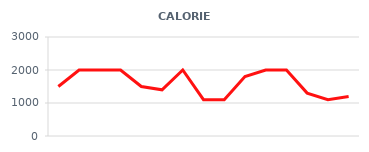
| Category | Series 0 |
|---|---|
| 2012-06-01 | 1500 |
| 2012-06-02 | 2000 |
| 2012-06-03 | 2000 |
| 2012-06-04 | 2000 |
| 2012-06-05 | 1500 |
| 2012-06-06 | 1400 |
| 2012-06-07 | 2000 |
| 2012-06-08 | 1100 |
| 2012-06-09 | 1100 |
| 2012-06-10 | 1800 |
| 2012-06-11 | 2000 |
| 2012-06-12 | 2000 |
| 2012-06-13 | 1300 |
| 2012-06-14 | 1100 |
| 2012-06-15 | 1200 |